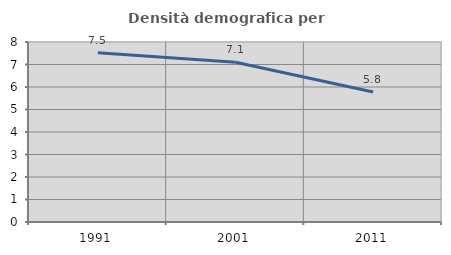
| Category | Densità demografica |
|---|---|
| 1991.0 | 7.518 |
| 2001.0 | 7.102 |
| 2011.0 | 5.78 |